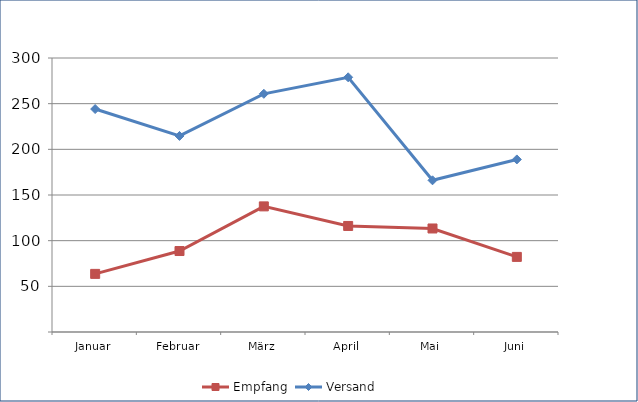
| Category | Empfang | Versand |
|---|---|---|
| Januar | 63.636 | 244.116 |
| Februar | 88.658 | 214.661 |
| März | 137.541 | 260.79 |
| April | 116.109 | 278.86 |
| Mai | 113.355 | 166.089 |
| Juni | 82.233 | 188.948 |